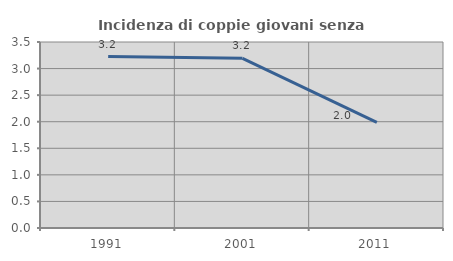
| Category | Incidenza di coppie giovani senza figli |
|---|---|
| 1991.0 | 3.226 |
| 2001.0 | 3.193 |
| 2011.0 | 1.988 |